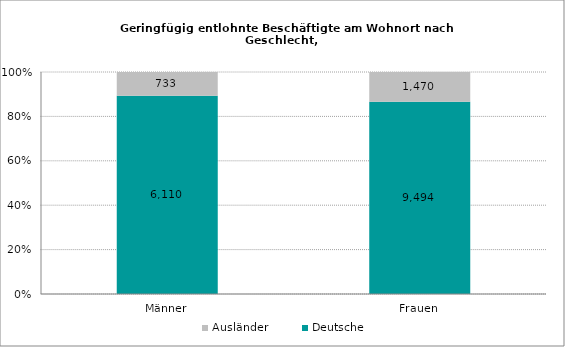
| Category | Deutsche | Ausländer |
|---|---|---|
| Männer | 6110 | 733 |
| Frauen | 9494 | 1470 |